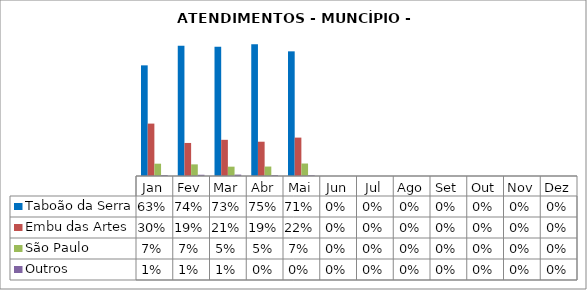
| Category | Taboão da Serra | Embu das Artes | São Paulo | Outros |
|---|---|---|---|---|
| Jan | 0.628 | 0.297 | 0.07 | 0.005 |
| Fev | 0.74 | 0.187 | 0.066 | 0.007 |
| Mar | 0.734 | 0.205 | 0.053 | 0.008 |
| Abr | 0.747 | 0.195 | 0.054 | 0.005 |
| Mai | 0.707 | 0.218 | 0.071 | 0.004 |
| Jun | 0 | 0 | 0 | 0 |
| Jul | 0 | 0 | 0 | 0 |
| Ago | 0 | 0 | 0 | 0 |
| Set | 0 | 0 | 0 | 0 |
| Out | 0 | 0 | 0 | 0 |
| Nov | 0 | 0 | 0 | 0 |
| Dez | 0 | 0 | 0 | 0 |